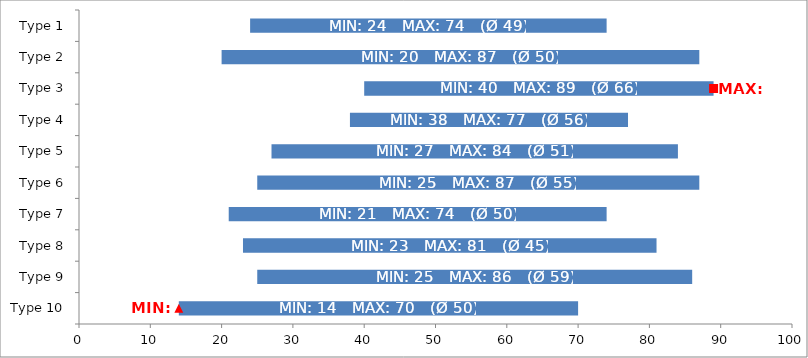
| Category | Blank | Bar |
|---|---|---|
| Type 10 | 14 | 56 |
| Type 9 | 25 | 61 |
| Type 8 | 23 | 58 |
| Type 7 | 21 | 53 |
| Type 6 | 25 | 62 |
| Type 5 | 27 | 57 |
| Type 4 | 38 | 39 |
| Type 3 | 40 | 49 |
| Type 2 | 20 | 67 |
| Type 1 | 24 | 50 |